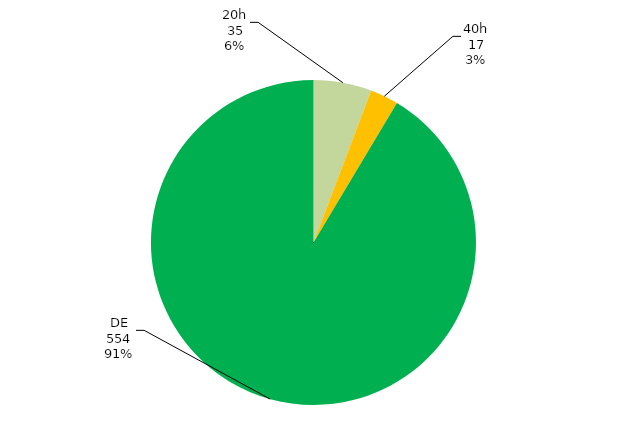
| Category | Total Geral |
|---|---|
| 20h | 35 |
| 40h | 17 |
| DE | 554 |